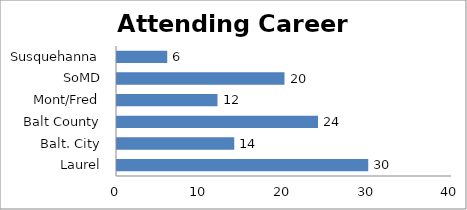
| Category | Attending Career Restart |
|---|---|
| Laurel | 30 |
| Balt. City | 14 |
| Balt County | 24 |
| Mont/Fred | 12 |
| SoMD | 20 |
| Susquehanna | 6 |